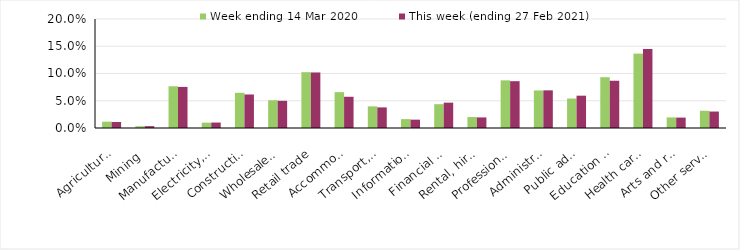
| Category | Week ending 14 Mar 2020 | This week (ending 27 Feb 2021) |
|---|---|---|
| Agriculture, forestry and fishing | 0.012 | 0.011 |
| Mining | 0.003 | 0.003 |
| Manufacturing | 0.077 | 0.075 |
| Electricity, gas, water and waste services | 0.01 | 0.01 |
| Construction | 0.065 | 0.062 |
| Wholesale trade | 0.051 | 0.05 |
| Retail trade | 0.102 | 0.102 |
| Accommodation and food services | 0.066 | 0.057 |
| Transport, postal and warehousing | 0.04 | 0.038 |
| Information media and telecommunications | 0.016 | 0.015 |
| Financial and insurance services | 0.044 | 0.046 |
| Rental, hiring and real estate services | 0.02 | 0.019 |
| Professional, scientific and technical services | 0.087 | 0.086 |
| Administrative and support services | 0.069 | 0.069 |
| Public administration and safety | 0.054 | 0.059 |
| Education and training | 0.093 | 0.087 |
| Health care and social assistance | 0.136 | 0.145 |
| Arts and recreation services | 0.019 | 0.019 |
| Other services | 0.032 | 0.03 |